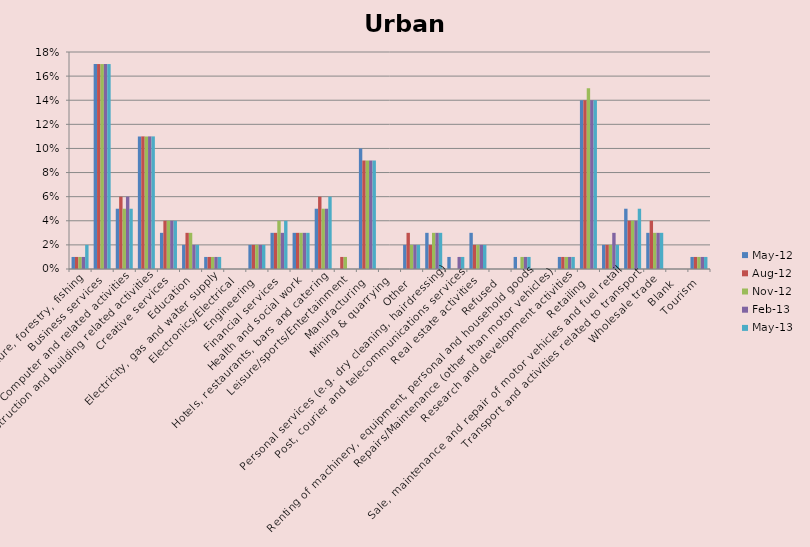
| Category | May-12 | Aug-12 | Nov-12 | Feb-13 | May-13 |
|---|---|---|---|---|---|
| Agriculture, forestry, fishing | 0.01 | 0.01 | 0.01 | 0.01 | 0.02 |
| Business services | 0.17 | 0.17 | 0.17 | 0.17 | 0.17 |
| Computer and related activities | 0.05 | 0.06 | 0.05 | 0.06 | 0.05 |
| Construction and building related activities | 0.11 | 0.11 | 0.11 | 0.11 | 0.11 |
| Creative services | 0.03 | 0.04 | 0.04 | 0.04 | 0.04 |
| Education | 0.02 | 0.03 | 0.03 | 0.02 | 0.02 |
| Electricity, gas and water supply | 0.01 | 0.01 | 0.01 | 0.01 | 0.01 |
| Electronics/Electrical | 0 | 0 | 0 | 0 | 0 |
| Engineering | 0.02 | 0.02 | 0.02 | 0.02 | 0.02 |
| Financial services | 0.03 | 0.03 | 0.04 | 0.03 | 0.04 |
| Health and social work | 0.03 | 0.03 | 0.03 | 0.03 | 0.03 |
| Hotels, restaurants, bars and catering | 0.05 | 0.06 | 0.05 | 0.05 | 0.06 |
| Leisure/sports/Entertainment | 0 | 0.01 | 0.01 | 0 | 0 |
| Manufacturing | 0.1 | 0.09 | 0.09 | 0.09 | 0.09 |
| Mining & quarrying | 0 | 0 | 0 | 0 | 0 |
| Other | 0.02 | 0.03 | 0.02 | 0.02 | 0.02 |
| Personal services (e.g. dry cleaning, hairdressing) | 0.03 | 0.02 | 0.03 | 0.03 | 0.03 |
| Post, courier and telecommunications services | 0.01 | 0 | 0 | 0.01 | 0.01 |
| Real estate activities | 0.03 | 0.02 | 0.02 | 0.02 | 0.02 |
| Refused | 0 | 0 | 0 | 0 | 0 |
| Renting of machinery, equipment, personal and household goods | 0.01 | 0 | 0.01 | 0.01 | 0.01 |
| Repairs/Maintenance (other than motor vehicles) | 0 | 0 | 0 | 0 | 0 |
| Research and development activities | 0.01 | 0.01 | 0.01 | 0.01 | 0.01 |
| Retailing | 0.14 | 0.14 | 0.15 | 0.14 | 0.14 |
| Sale, maintenance and repair of motor vehicles and fuel retail | 0.02 | 0.02 | 0.02 | 0.03 | 0.02 |
| Transport and activities related to transport | 0.05 | 0.04 | 0.04 | 0.04 | 0.05 |
| Wholesale trade | 0.03 | 0.04 | 0.03 | 0.03 | 0.03 |
| Blank | 0 | 0 | 0 | 0 | 0 |
| Tourism | 0.01 | 0.01 | 0.01 | 0.01 | 0.01 |